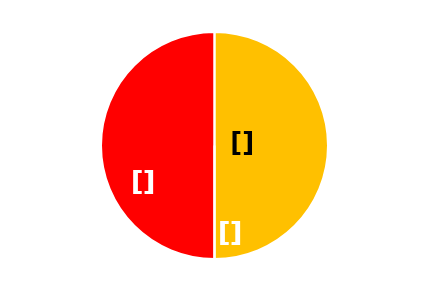
| Category | Series 0 |
|---|---|
| 0 | 31 |
| 1 | 0 |
| 2 | 31 |